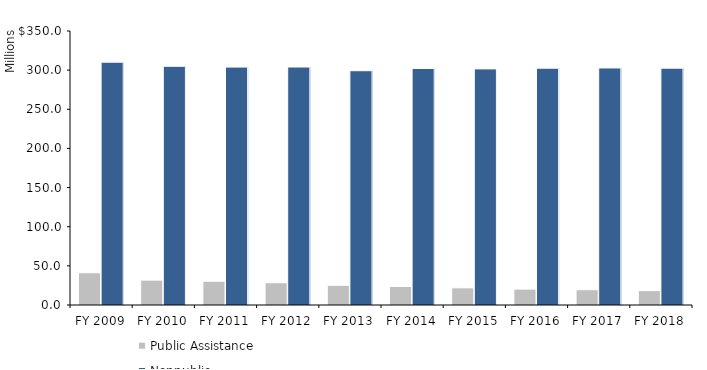
| Category | Public Assistance | Nonpublic Assistance |
|---|---|---|
| FY 2009 | 41185224 | 310146849 |
| FY 2010 | 31755076 | 304920209 |
| FY 2011 | 30367192 | 303906387 |
| FY 2012 | 28425184 | 303979518 |
| FY 2013 | 25166747 | 299266988 |
| FY 2014 | 23657197 | 302114783 |
| FY 2015 | 21968076 | 301617539 |
| FY 2016 | 20328008 | 302493713 |
| FY 2017 | 19535707 | 302799500 |
| FY 2018 | 18355526 | 302482957 |